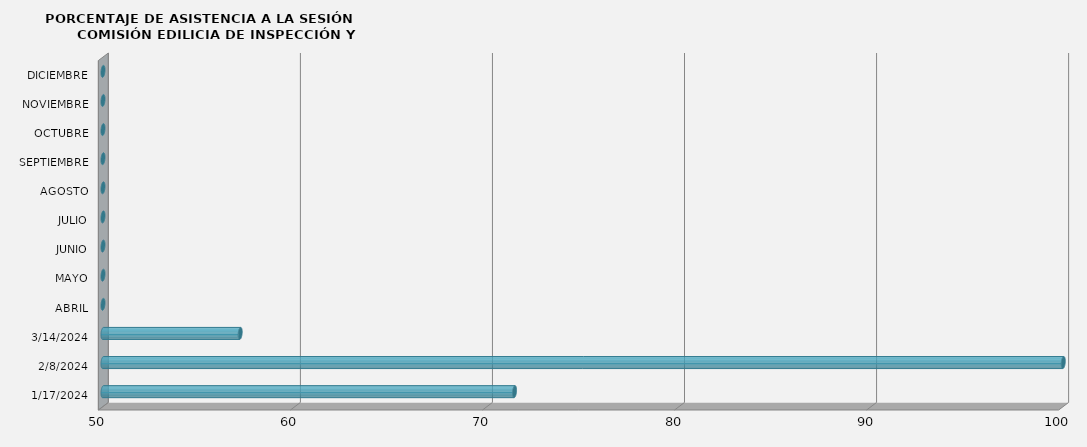
| Category | Series 0 |
|---|---|
| 17/01/2024 | 71.429 |
| 08/02/2024 | 100 |
| 14/03/2024 | 57.143 |
| ABRIL | 0 |
| MAYO | 0 |
| JUNIO | 0 |
| JULIO | 0 |
| AGOSTO | 0 |
| SEPTIEMBRE | 0 |
| OCTUBRE | 0 |
| NOVIEMBRE | 0 |
| DICIEMBRE | 0 |